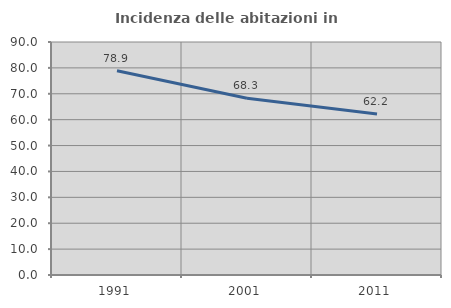
| Category | Incidenza delle abitazioni in proprietà  |
|---|---|
| 1991.0 | 78.864 |
| 2001.0 | 68.259 |
| 2011.0 | 62.199 |